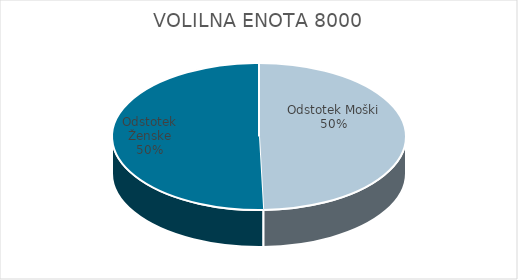
| Category | VOLILNA ENOTA 8000 | #REF! | Slovenija skupaj |
|---|---|---|---|
| Odstotek Moški | 17.93 |  | 19.85 |
| Odstotek Ženske | 18.26 |  | 21.47 |